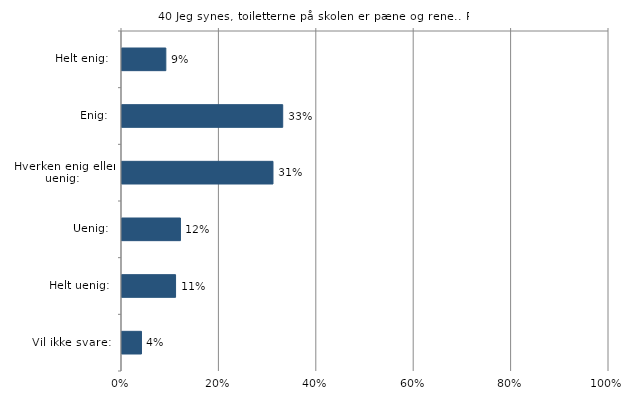
| Category | Jeg synes, toiletterne på skolen er pæne og rene. |
|---|---|
| Helt enig:  | 0.09 |
| Enig:  | 0.33 |
| Hverken enig eller uenig:  | 0.31 |
| Uenig:  | 0.12 |
| Helt uenig:  | 0.11 |
| Vil ikke svare:  | 0.04 |